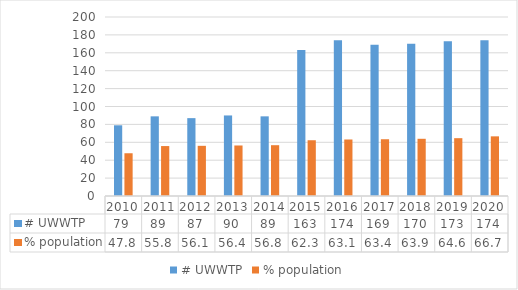
| Category | # UWWTP | % population |
|---|---|---|
| 2010.0 | 79 | 47.76 |
| 2011.0 | 89 | 55.8 |
| 2012.0 | 87 | 56.06 |
| 2013.0 | 90 | 56.44 |
| 2014.0 | 89 | 56.76 |
| 2015.0 | 163 | 62.3 |
| 2016.0 | 174 | 63.14 |
| 2017.0 | 169 | 63.42 |
| 2018.0 | 170 | 63.92 |
| 2019.0 | 173 | 64.61 |
| 2020.0 | 174 | 66.65 |